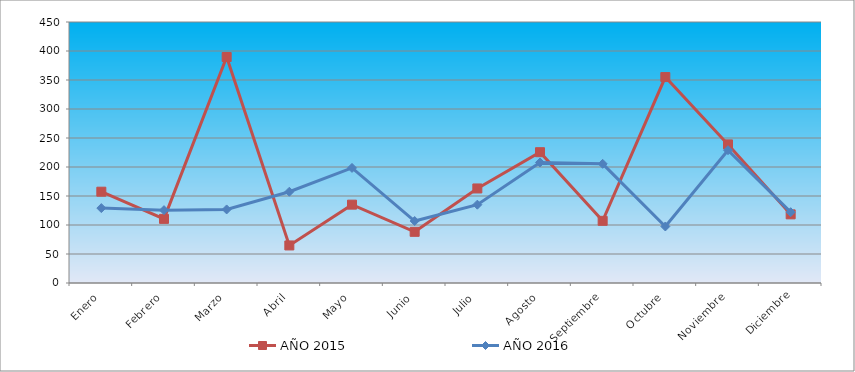
| Category | AÑO 2015 | AÑO 2016 |
|---|---|---|
| Enero | 157.427 | 129.154 |
| Febrero | 110.534 | 125.631 |
| Marzo | 389.66 | 126.805 |
| Abril | 64.757 | 157.333 |
| Mayo | 135.097 | 198.427 |
| Junio | 88.204 | 106.845 |
| Julio | 163.01 | 135.024 |
| Agosto | 225.534 | 207.82 |
| Septiembre | 107.184 | 205.472 |
| Octubre | 355.049 | 97.452 |
| Noviembre | 238.932 | 228.954 |
| Diciembre | 118.35 | 122.109 |